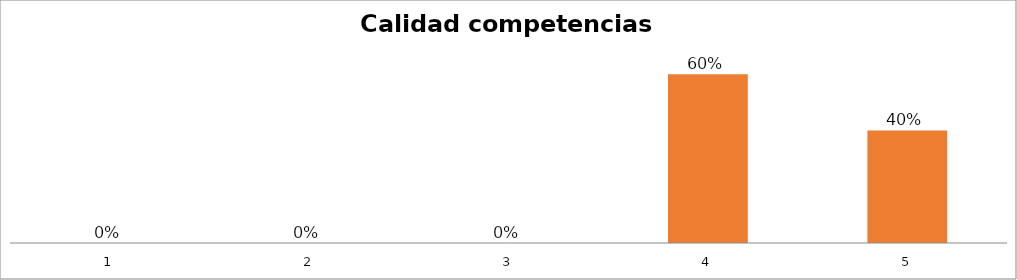
| Category | Series 1 |
|---|---|
| 0 | 0 |
| 1 | 0 |
| 2 | 0 |
| 3 | 0.6 |
| 4 | 0.4 |